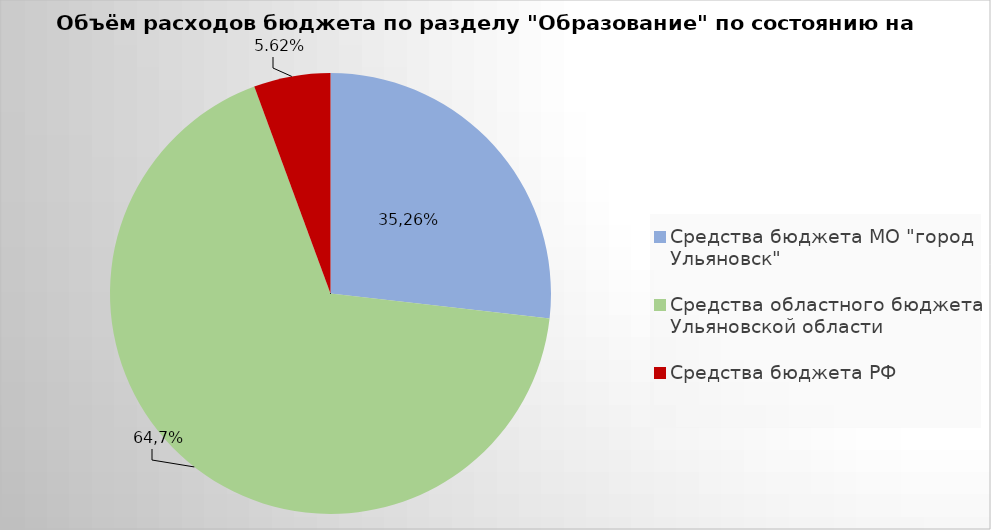
| Category | Series 0 |
|---|---|
| Средства бюджета МО "город Ульяновск" | 2048025.56 |
| Средства областного бюджета Ульяновской области | 5163847.48 |
| Средства бюджета РФ | 429251.76 |